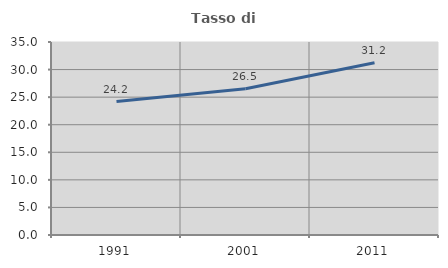
| Category | Tasso di occupazione   |
|---|---|
| 1991.0 | 24.205 |
| 2001.0 | 26.531 |
| 2011.0 | 31.229 |